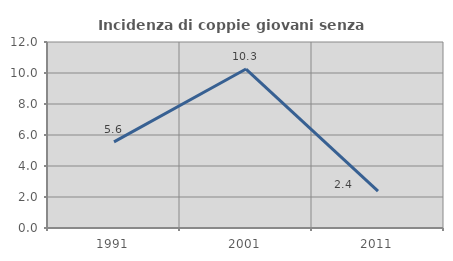
| Category | Incidenza di coppie giovani senza figli |
|---|---|
| 1991.0 | 5.556 |
| 2001.0 | 10.256 |
| 2011.0 | 2.381 |